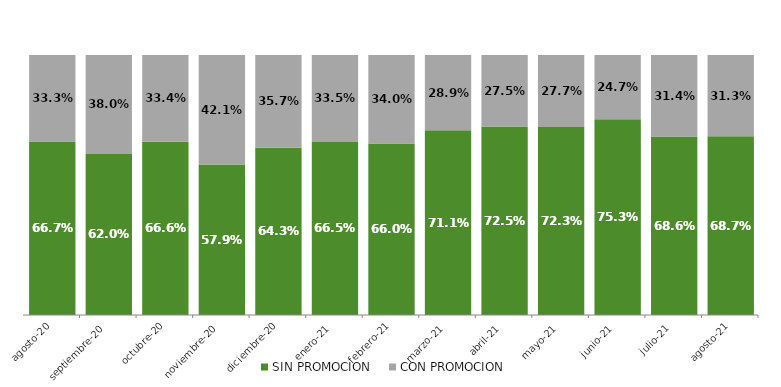
| Category | SIN PROMOCION   | CON PROMOCION   |
|---|---|---|
| 2020-08-01 | 0.667 | 0.333 |
| 2020-09-01 | 0.62 | 0.38 |
| 2020-10-01 | 0.666 | 0.334 |
| 2020-11-01 | 0.579 | 0.421 |
| 2020-12-01 | 0.643 | 0.357 |
| 2021-01-01 | 0.665 | 0.335 |
| 2021-02-01 | 0.66 | 0.34 |
| 2021-03-01 | 0.711 | 0.289 |
| 2021-04-01 | 0.725 | 0.275 |
| 2021-05-01 | 0.723 | 0.277 |
| 2021-06-01 | 0.753 | 0.247 |
| 2021-07-01 | 0.686 | 0.314 |
| 2021-08-01 | 0.687 | 0.313 |